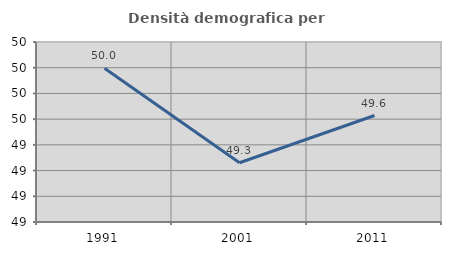
| Category | Densità demografica |
|---|---|
| 1991.0 | 49.995 |
| 2001.0 | 49.261 |
| 2011.0 | 49.628 |